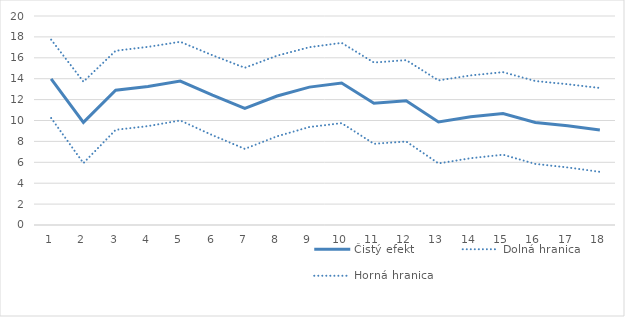
| Category | Čistý efekt | Dolná hranica | Horná hranica |
|---|---|---|---|
| 1.0 | 13.987 | 10.236 | 17.737 |
| 2.0 | 9.818 | 5.922 | 13.714 |
| 3.0 | 12.892 | 9.109 | 16.676 |
| 4.0 | 13.255 | 9.464 | 17.046 |
| 5.0 | 13.766 | 10.003 | 17.53 |
| 6.0 | 12.418 | 8.594 | 16.242 |
| 7.0 | 11.164 | 7.284 | 15.044 |
| 8.0 | 12.345 | 8.488 | 16.202 |
| 9.0 | 13.196 | 9.376 | 17.015 |
| 10.0 | 13.588 | 9.747 | 17.428 |
| 11.0 | 11.659 | 7.77 | 15.547 |
| 12.0 | 11.884 | 7.989 | 15.778 |
| 13.0 | 9.865 | 5.894 | 13.837 |
| 14.0 | 10.353 | 6.392 | 14.315 |
| 15.0 | 10.676 | 6.725 | 14.627 |
| 16.0 | 9.812 | 5.846 | 13.777 |
| 17.0 | 9.491 | 5.51 | 13.472 |
| 18.0 | 9.099 | 5.087 | 13.111 |